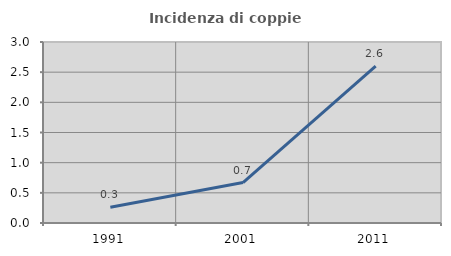
| Category | Incidenza di coppie miste |
|---|---|
| 1991.0 | 0.261 |
| 2001.0 | 0.671 |
| 2011.0 | 2.602 |